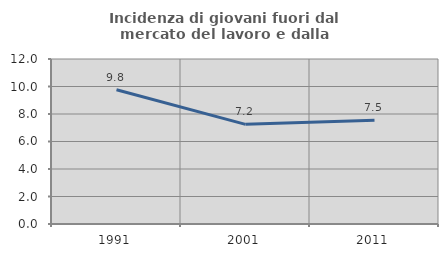
| Category | Incidenza di giovani fuori dal mercato del lavoro e dalla formazione  |
|---|---|
| 1991.0 | 9.767 |
| 2001.0 | 7.246 |
| 2011.0 | 7.547 |